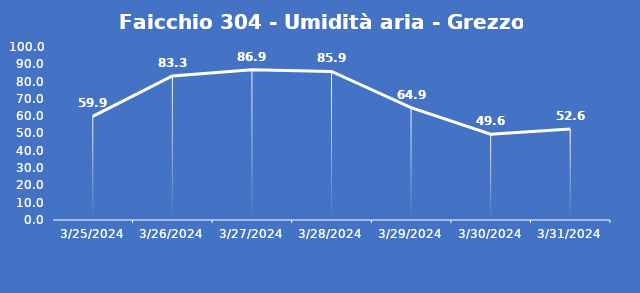
| Category | Faicchio 304 - Umidità aria - Grezzo (%) |
|---|---|
| 3/25/24 | 59.9 |
| 3/26/24 | 83.3 |
| 3/27/24 | 86.9 |
| 3/28/24 | 85.9 |
| 3/29/24 | 64.9 |
| 3/30/24 | 49.6 |
| 3/31/24 | 52.6 |